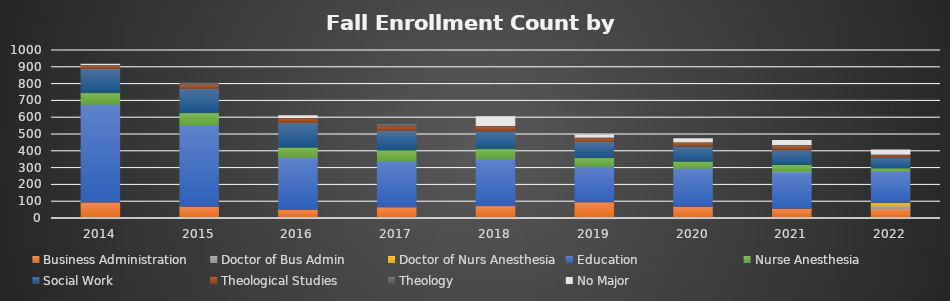
| Category | Business Administration | Doctor of Bus Admin | Doctor of Nurs Anesthesia | Education | Nurse Anesthesia | Social Work | Theological Studies | Theology | No Major |
|---|---|---|---|---|---|---|---|---|---|
| 2014.0 | 96 | 0 | 0 | 582 | 71 | 141 | 19 | 8 | 1 |
| 2015.0 | 71 | 0 | 0 | 483 | 75 | 143 | 24 | 10 | 0 |
| 2016.0 | 53 | 0 | 0 | 309 | 62 | 145 | 29 | 3 | 10 |
| 2017.0 | 68 | 0 | 0 | 273 | 66 | 116 | 27 | 10 | 0 |
| 2018.0 | 75 | 0 | 0 | 279 | 61 | 104 | 28 | 7 | 51 |
| 2019.0 | 98 | 0 | 0 | 212 | 51 | 95 | 21 | 8 | 12 |
| 2020.0 | 72 | 0 | 0 | 225 | 44 | 88 | 23 | 5 | 18 |
| 2021.0 | 59 | 0 | 0 | 218 | 44 | 86 | 25 | 8 | 25 |
| 2022.0 | 57 | 17 | 20 | 186 | 20 | 63 | 14 | 7 | 24 |